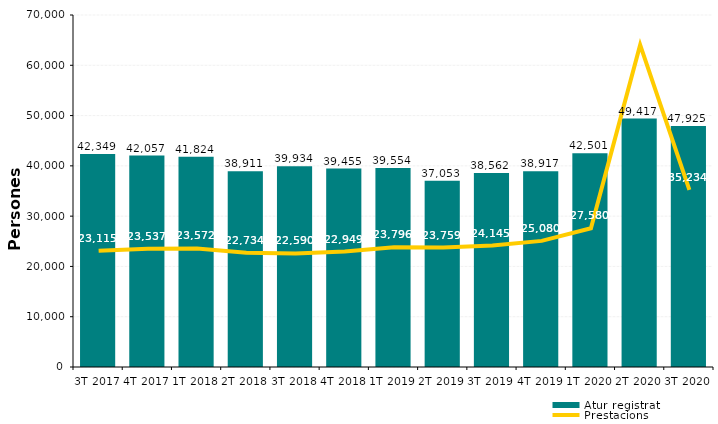
| Category | Atur registrat |
|---|---|
| 3T 2017 | 42349 |
| 4T 2017 | 42057 |
| 1T 2018 | 41824 |
| 2T 2018 | 38911 |
| 3T 2018 | 39934 |
| 4T 2018 | 39455 |
| 1T 2019 | 39554 |
| 2T 2019 | 37053 |
| 3T 2019 | 38562 |
| 4T 2019 | 38917 |
| 1T 2020 | 42501 |
| 2T 2020 | 49417 |
| 3T 2020 | 47925 |